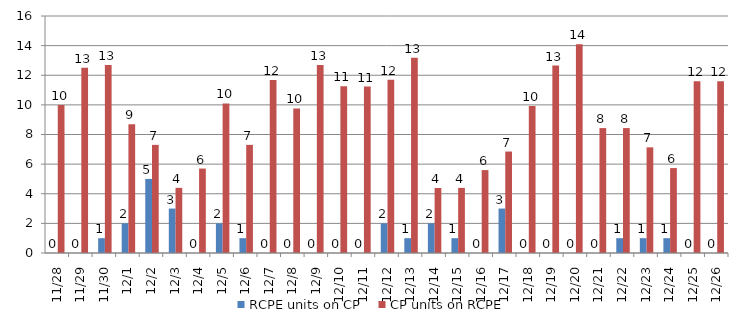
| Category | RCPE units on CP | CP units on RCPE |
|---|---|---|
| 2015-11-28 | 0 | 10 |
| 2015-11-29 | 0 | 12.5 |
| 2015-11-30 | 1 | 12.7 |
| 2015-12-01 | 2 | 8.7 |
| 2015-12-02 | 5 | 7.3 |
| 2015-12-03 | 3 | 4.4 |
| 2015-12-04 | 0 | 5.7 |
| 2015-12-05 | 2 | 10.1 |
| 2015-12-06 | 1 | 7.3 |
| 2015-12-07 | 0 | 11.68 |
| 2015-12-08 | 0 | 9.76 |
| 2015-12-09 | 0 | 12.697 |
| 2015-12-10 | 0 | 11.25 |
| 2015-12-11 | 0 | 11.237 |
| 2015-12-12 | 2 | 11.703 |
| 2015-12-13 | 1 | 13.183 |
| 2015-12-14 | 2 | 4.387 |
| 2015-12-15 | 1 | 4.397 |
| 2015-12-16 | 0 | 5.597 |
| 2015-12-17 | 3 | 6.85 |
| 2015-12-18 | 0 | 9.92 |
| 2015-12-19 | 0 | 12.653 |
| 2015-12-20 | 0 | 14.087 |
| 2015-12-21 | 0 | 8.433 |
| 2015-12-22 | 1 | 8.433 |
| 2015-12-23 | 1 | 7.133 |
| 2015-12-24 | 1 | 5.733 |
| 2015-12-25 | 0 | 11.6 |
| 2015-12-26 | 0 | 11.6 |